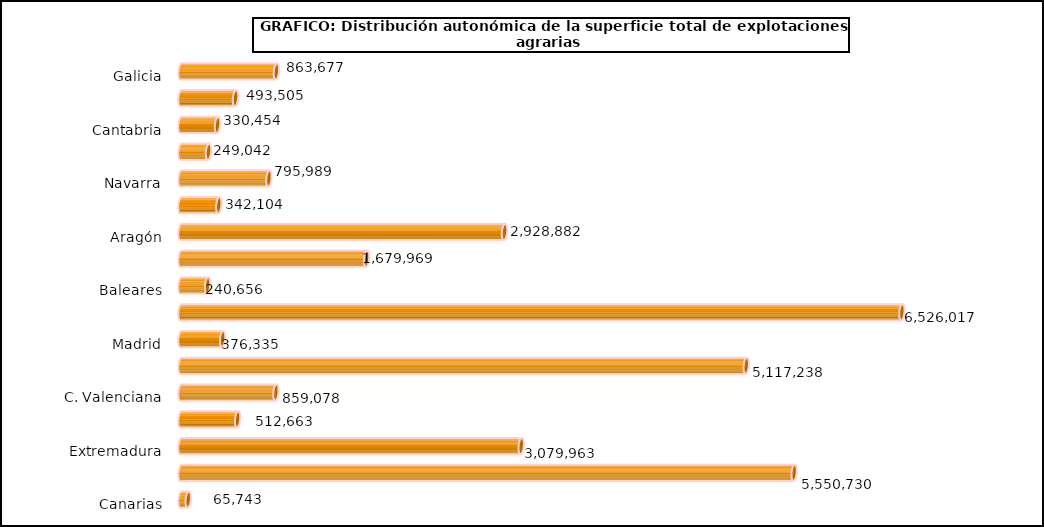
| Category | superficie |
|---|---|
| 0 | 863677 |
| 1 | 493505 |
| 2 | 330454 |
| 3 | 249042 |
| 4 | 795989 |
| 5 | 342104 |
| 6 | 2928882 |
| 7 | 1679969 |
| 8 | 240656 |
| 9 | 6526017 |
| 10 | 376335 |
| 11 | 5117238 |
| 12 | 859078 |
| 13 | 512663 |
| 14 | 3079963 |
| 15 | 5550730 |
| 16 | 65743 |